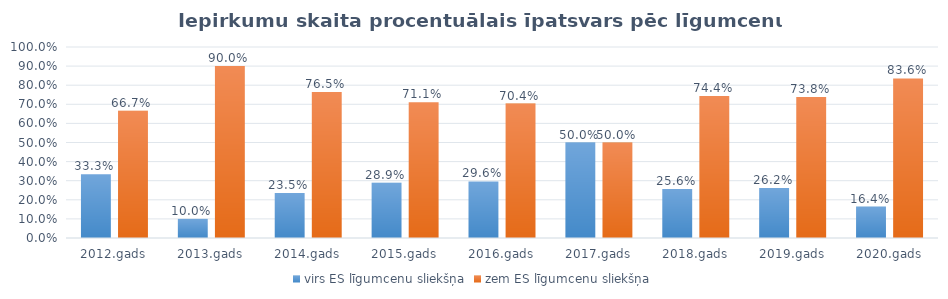
| Category | virs ES līgumcenu sliekšņa | zem ES līgumcenu sliekšņa |
|---|---|---|
| 2012.gads | 0.333 | 0.667 |
| 2013.gads | 0.1 | 0.9 |
| 2014.gads | 0.235 | 0.765 |
| 2015.gads | 0.289 | 0.711 |
| 2016.gads | 0.296 | 0.704 |
| 2017.gads | 0.5 | 0.5 |
| 2018.gads | 0.256 | 0.744 |
| 2019.gads | 0.262 | 0.738 |
| 2020.gads | 0.164 | 0.836 |